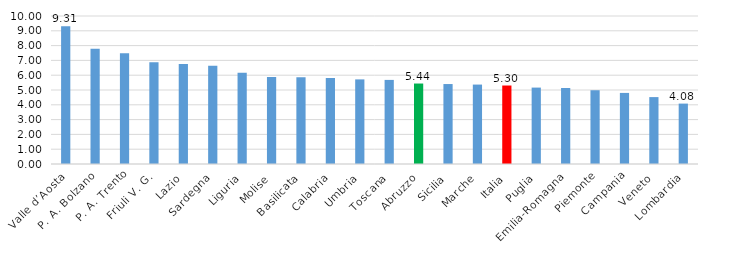
| Category | Series 0 |
|---|---|
| Valle d’Aosta | 9.314 |
| P. A. Bolzano | 7.786 |
| P. A. Trento | 7.482 |
| Friuli V. G. | 6.88 |
| Lazio | 6.752 |
| Sardegna | 6.644 |
| Liguria | 6.171 |
| Molise | 5.874 |
| Basilicata | 5.862 |
| Calabria | 5.814 |
| Umbria | 5.717 |
| Toscana | 5.682 |
| Abruzzo | 5.437 |
| Sicilia | 5.403 |
| Marche | 5.367 |
| Italia | 5.303 |
| Puglia | 5.163 |
| Emilia-Romagna | 5.135 |
| Piemonte | 4.984 |
| Campania | 4.803 |
| Veneto | 4.521 |
| Lombardia | 4.081 |